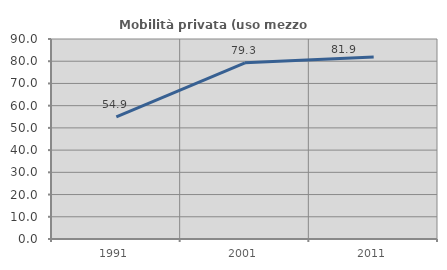
| Category | Mobilità privata (uso mezzo privato) |
|---|---|
| 1991.0 | 54.911 |
| 2001.0 | 79.306 |
| 2011.0 | 81.926 |